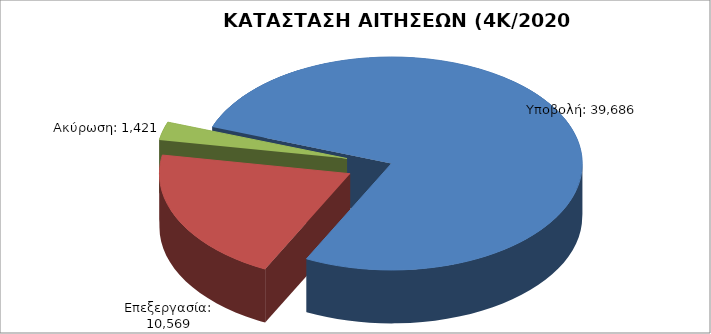
| Category | Series 0 |
|---|---|
| Υποβολή: | 39686 |
| Επεξεργασία: | 10569 |
| Ακύρωση: | 1421 |